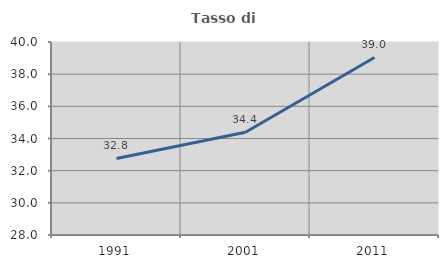
| Category | Tasso di occupazione   |
|---|---|
| 1991.0 | 32.759 |
| 2001.0 | 34.389 |
| 2011.0 | 39.037 |